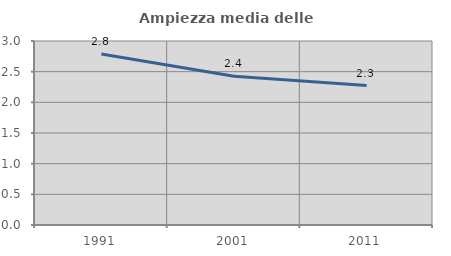
| Category | Ampiezza media delle famiglie |
|---|---|
| 1991.0 | 2.789 |
| 2001.0 | 2.425 |
| 2011.0 | 2.273 |